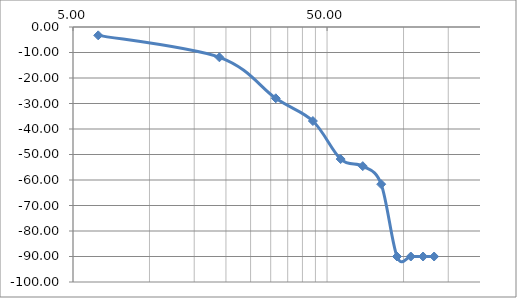
| Category | Series 0 |
|---|---|
| 6.283185307179586 | -3.276 |
| 18.84955592153876 | -11.881 |
| 31.41592653589793 | -27.953 |
| 43.982297150257104 | -36.87 |
| 56.548667764616276 | -51.787 |
| 69.11503837897544 | -54.569 |
| 81.68140899333463 | -61.642 |
| 94.24777960769379 | -90 |
| 106.81415022205297 | -90 |
| 119.38052083641213 | -90 |
| 131.94689145077132 | -90 |